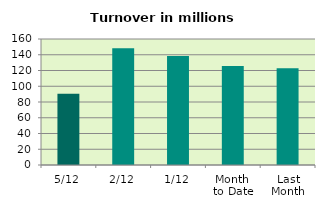
| Category | Series 0 |
|---|---|
| 5/12 | 90.403 |
| 2/12 | 148.363 |
| 1/12 | 138.462 |
| Month 
to Date | 125.743 |
| Last
Month | 122.873 |